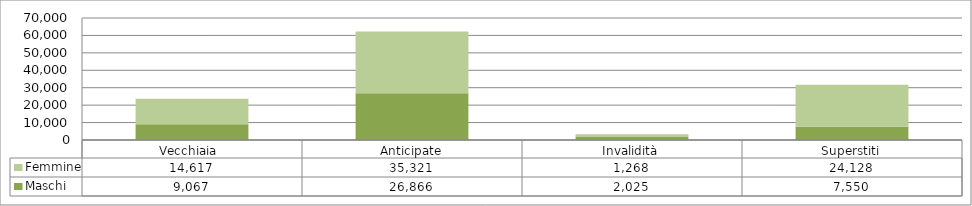
| Category | Maschi | Femmine |
|---|---|---|
| Vecchiaia  | 9067 | 14617 |
| Anticipate | 26866 | 35321 |
| Invalidità | 2025 | 1268 |
| Superstiti | 7550 | 24128 |